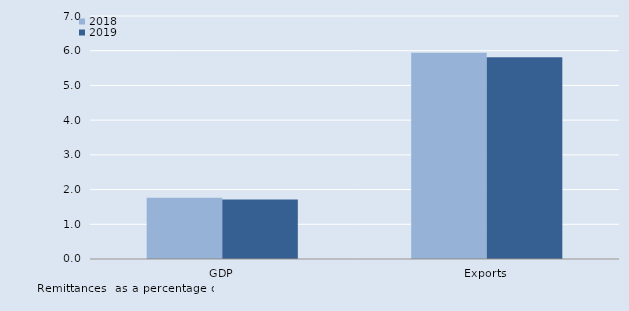
| Category | 2018 | 2019 |
|---|---|---|
| GDP | 1.764 | 1.717 |
| Exports | 5.939 | 5.815 |